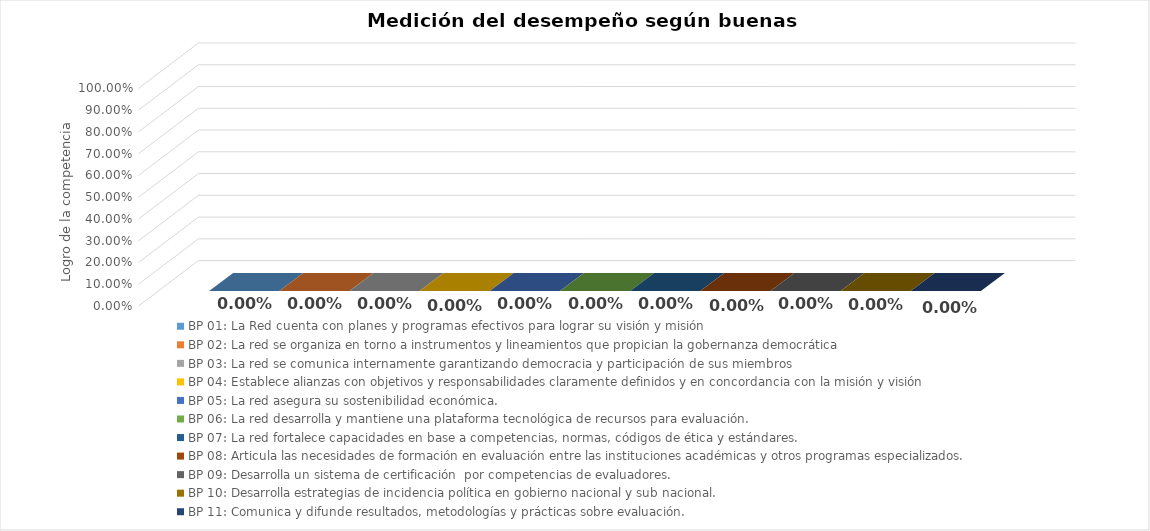
| Category | BP 01: La Red cuenta con planes y programas efectivos para lograr su visión y misión | BP 02: La red se organiza en torno a instrumentos y lineamientos que propician la gobernanza democrática | BP 03: La red se comunica internamente garantizando democracia y participación de sus miembros | BP 04: Establece alianzas con objetivos y responsabilidades claramente definidos y en concordancia con la misión y visión  | BP 05: La red asegura su sostenibilidad económica. | BP 06: La red desarrolla y mantiene una plataforma tecnológica de recursos para evaluación. | BP 07: La red fortalece capacidades en base a competencias, normas, códigos de ética y estándares. | BP 08: Articula las necesidades de formación en evaluación entre las instituciones académicas y otros programas especializados. | BP 09: Desarrolla un sistema de certificación  por competencias de evaluadores. | BP 10: Desarrolla estrategias de incidencia política en gobierno nacional y sub nacional. | BP 11: Comunica y difunde resultados, metodologías y prácticas sobre evaluación. |
|---|---|---|---|---|---|---|---|---|---|---|---|
| 0 | 0 | 0 | 0 | 0 | 0 | 0 | 0 | 0 | 0 | 0 | 0 |